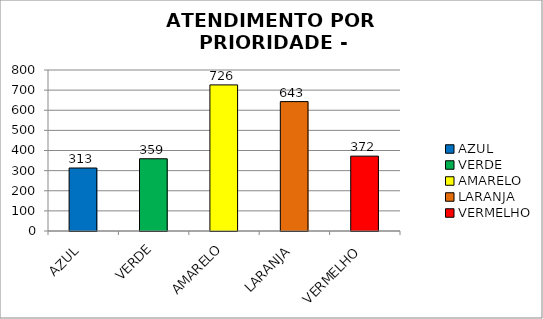
| Category | Total Regional: |
|---|---|
| AZUL | 313 |
| VERDE | 359 |
| AMARELO | 726 |
| LARANJA | 643 |
| VERMELHO | 372 |